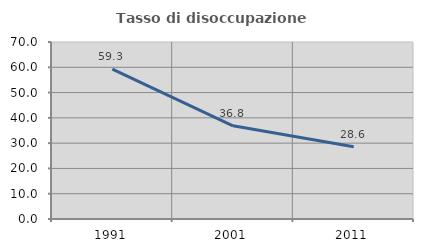
| Category | Tasso di disoccupazione giovanile  |
|---|---|
| 1991.0 | 59.259 |
| 2001.0 | 36.842 |
| 2011.0 | 28.571 |